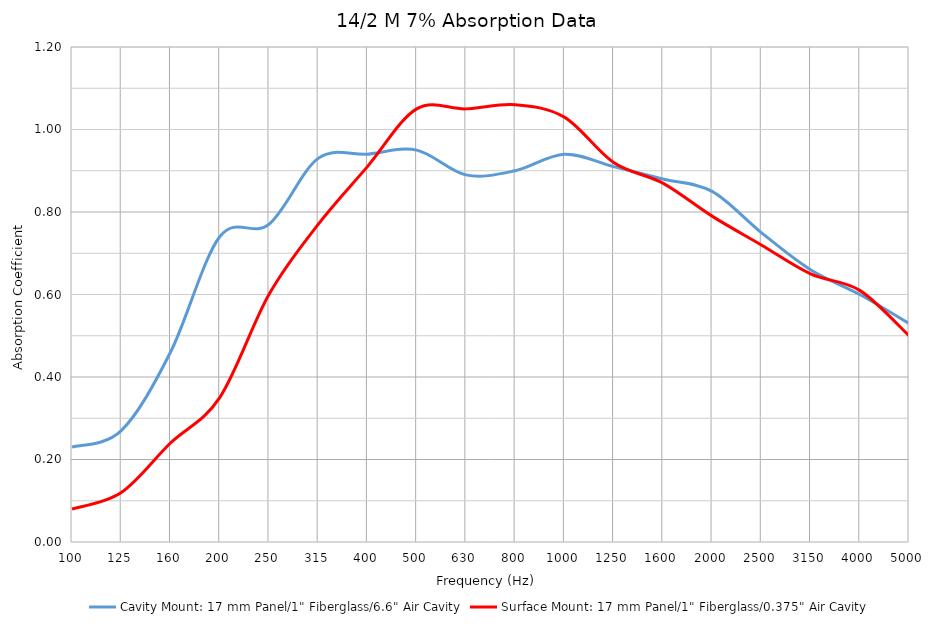
| Category | Cavity Mount: 17 mm Panel/1" Fiberglass/6.6" Air Cavity | Surface Mount: 17 mm Panel/1" Fiberglass/0.375" Air Cavity |
|---|---|---|
| 100.0 | 0.23 | 0.08 |
| 125.0 | 0.27 | 0.12 |
| 160.0 | 0.46 | 0.24 |
| 200.0 | 0.74 | 0.35 |
| 250.0 | 0.77 | 0.6 |
| 315.0 | 0.93 | 0.77 |
| 400.0 | 0.94 | 0.91 |
| 500.0 | 0.95 | 1.05 |
| 630.0 | 0.89 | 1.05 |
| 800.0 | 0.9 | 1.06 |
| 1000.0 | 0.94 | 1.03 |
| 1250.0 | 0.91 | 0.92 |
| 1600.0 | 0.88 | 0.87 |
| 2000.0 | 0.85 | 0.79 |
| 2500.0 | 0.75 | 0.72 |
| 3150.0 | 0.66 | 0.65 |
| 4000.0 | 0.6 | 0.61 |
| 5000.0 | 0.53 | 0.5 |